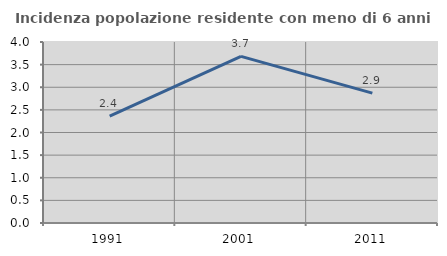
| Category | Incidenza popolazione residente con meno di 6 anni |
|---|---|
| 1991.0 | 2.36 |
| 2001.0 | 3.683 |
| 2011.0 | 2.869 |